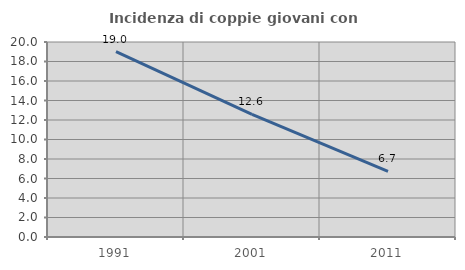
| Category | Incidenza di coppie giovani con figli |
|---|---|
| 1991.0 | 19.004 |
| 2001.0 | 12.571 |
| 2011.0 | 6.739 |